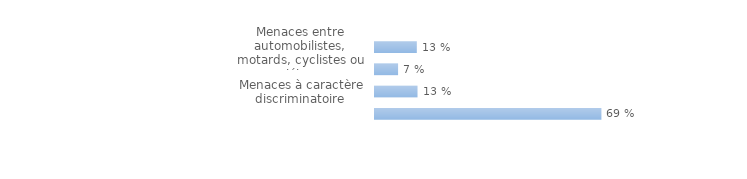
| Category | Series 0 |
|---|---|
| Menaces entre automobilistes, motards, cyclistes ou piétons | 0.127 |
| Menaces à la suite d'une sollicitation d'un inconnu | 0.07 |
| Menaces à caractère discriminatoire  | 0.129 |
| Autres menaces | 0.686 |